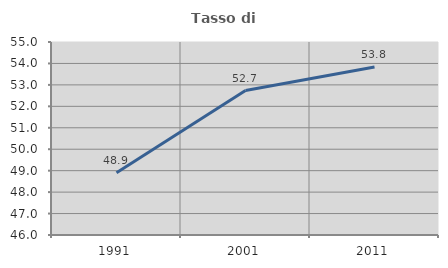
| Category | Tasso di occupazione   |
|---|---|
| 1991.0 | 48.898 |
| 2001.0 | 52.735 |
| 2011.0 | 53.831 |